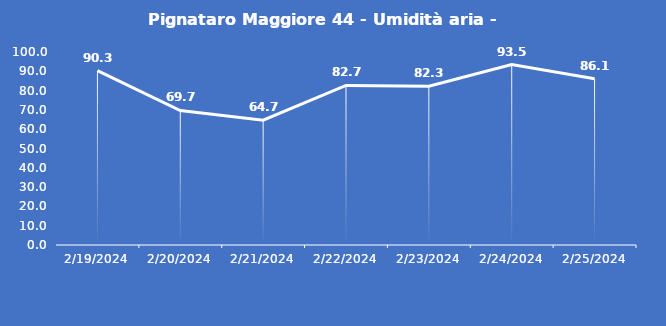
| Category | Pignataro Maggiore 44 - Umidità aria - Grezzo (%) |
|---|---|
| 2/19/24 | 90.3 |
| 2/20/24 | 69.7 |
| 2/21/24 | 64.7 |
| 2/22/24 | 82.7 |
| 2/23/24 | 82.3 |
| 2/24/24 | 93.5 |
| 2/25/24 | 86.1 |